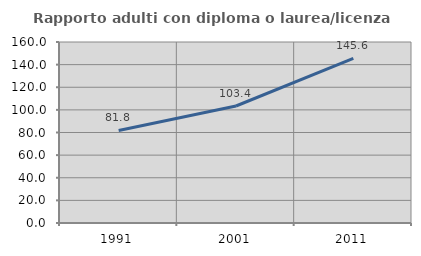
| Category | Rapporto adulti con diploma o laurea/licenza media  |
|---|---|
| 1991.0 | 81.789 |
| 2001.0 | 103.421 |
| 2011.0 | 145.6 |